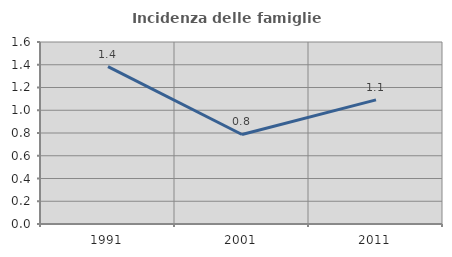
| Category | Incidenza delle famiglie numerose |
|---|---|
| 1991.0 | 1.384 |
| 2001.0 | 0.787 |
| 2011.0 | 1.091 |